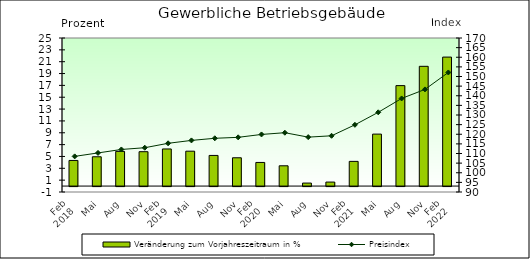
| Category | Veränderung zum Vorjahreszeitraum in % |
|---|---|
| 0 | 4.327 |
| 1 | 4.948 |
| 2 | 5.855 |
| 3 | 5.805 |
| 4 | 6.267 |
| 5 | 5.893 |
| 6 | 5.174 |
| 7 | 4.779 |
| 8 | 3.99 |
| 9 | 3.425 |
| 10 | 0.509 |
| 11 | 0.676 |
| 12 | 4.17 |
| 13 | 8.775 |
| 14 | 16.962 |
| 15 | 20.218 |
| 16 | 21.777 |